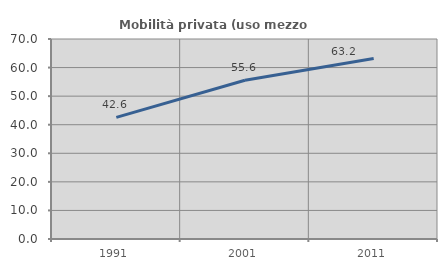
| Category | Mobilità privata (uso mezzo privato) |
|---|---|
| 1991.0 | 42.565 |
| 2001.0 | 55.572 |
| 2011.0 | 63.201 |